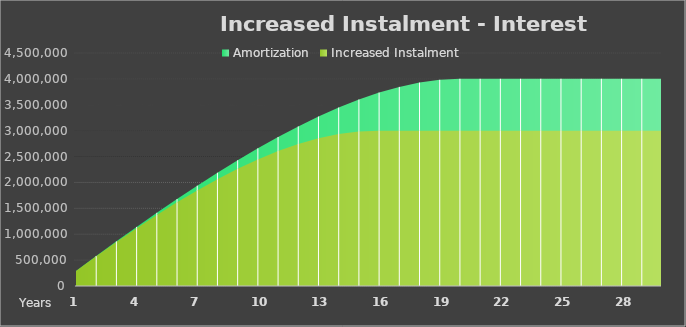
| Category | Amortization |  Increased Instalment  |
|---|---|---|
| 0 | 292004.659 | 290669.029 |
| 1 | 579902.701 | 574088.835 |
| 2 | 863184.746 | 849360.23 |
| 3 | 1141278.229 | 1115472.494 |
| 4 | 1413539.566 | 1371289.537 |
| 5 | 1679245.344 | 1615534.351 |
| 6 | 1937582.418 | 1846771.527 |
| 7 | 2187636.781 | 2063387.61 |
| 8 | 2428381.053 | 2263569.014 |
| 9 | 2658660.42 | 2445277.198 |
| 10 | 2877176.825 | 2606220.763 |
| 11 | 3082471.202 | 2743824.084 |
| 12 | 3272903.504 | 2855192.06 |
| 13 | 3446630.253 | 2937070.486 |
| 14 | 3601579.309 | 2985801.506 |
| 15 | 3735421.505 | 2998142.025 |
| 16 | 3845538.767 | 2998142.025 |
| 17 | 3928988.278 | 2998142.025 |
| 18 | 3982462.195 | 2998142.025 |
| 19 | 4002242.375 | 2998142.025 |
| 20 | 4002242.375 | 2998142.025 |
| 21 | 4002242.375 | 2998142.025 |
| 22 | 4002242.375 | 2998142.025 |
| 23 | 4002242.375 | 2998142.025 |
| 24 | 4002242.375 | 2998142.025 |
| 25 | 4002242.375 | 2998142.025 |
| 26 | 4002242.375 | 2998142.025 |
| 27 | 4002242.375 | 2998142.025 |
| 28 | 4002242.375 | 2998142.025 |
| 29 | 4002242.375 | 2998142.025 |